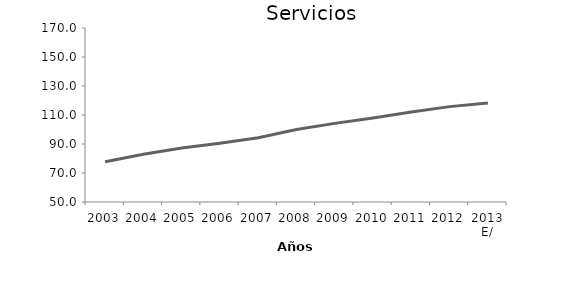
| Category | Servicios |
|---|---|
| 2003 | 77.809 |
| 2004 | 82.862 |
| 2005 | 87.174 |
| 2006 | 90.56 |
| 2007 | 94.277 |
| 2008 | 100 |
| 2009 | 104.231 |
| 2010 | 107.912 |
| 2011 | 112.132 |
| 2012 | 115.773 |
| 2013 E/ | 118.226 |